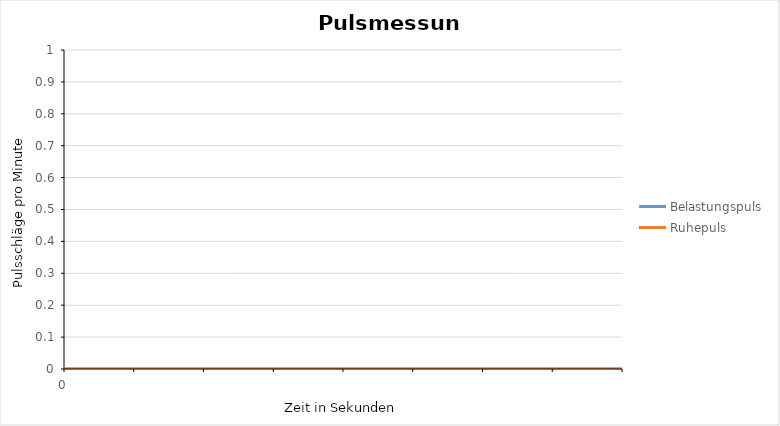
| Category | Belastungspuls | Ruhepuls |
|---|---|---|
| 0.0 | 0 | 0 |